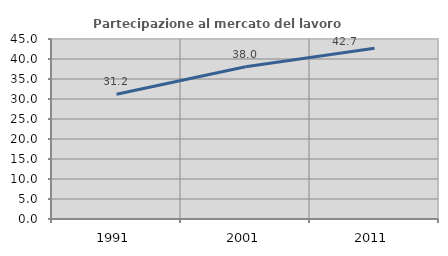
| Category | Partecipazione al mercato del lavoro  femminile |
|---|---|
| 1991.0 | 31.173 |
| 2001.0 | 38.049 |
| 2011.0 | 42.663 |